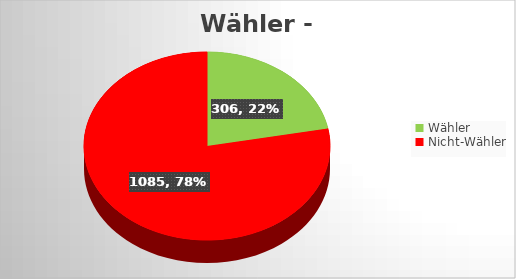
| Category | Series 0 |
|---|---|
| Wähler | 306 |
| Nicht-Wähler | 1085 |